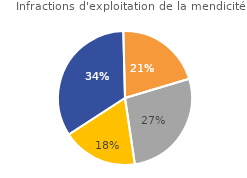
| Category | Infractions d'exploitation de la mendicité  |
|---|---|
| Instruction | 33.766 |
| COPJ* | 20.779 |
| Comparution immédiate | 27.273 |
| Autres | 18.182 |